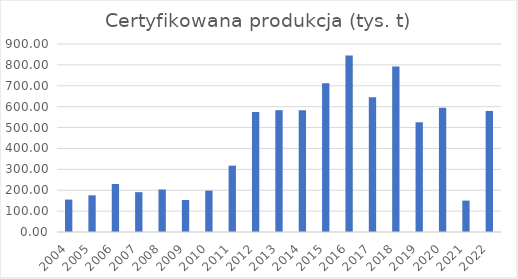
| Category | Certyfikowana produkcja (tys. t) |
|---|---|
| 2004.0 | 155.2 |
| 2005.0 | 175.5 |
| 2006.0 | 229.7 |
| 2007.0 | 190.7 |
| 2008.0 | 203.5 |
| 2009.0 | 153.2 |
| 2010.0 | 198.1 |
| 2011.0 | 317.6 |
| 2012.0 | 574.6 |
| 2013.0 | 583.096 |
| 2014.0 | 583.249 |
| 2015.0 | 711.924 |
| 2016.0 | 844.721 |
| 2017.0 | 645.279 |
| 2018.0 | 792.425 |
| 2019.0 | 525.317 |
| 2020.0 | 595.269 |
| 2021.0 | 150.306 |
| 2022.0 | 579.533 |